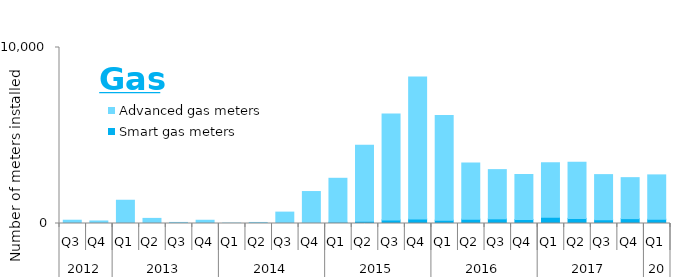
| Category | Smart gas meters | Advanced gas meters             |
|---|---|---|
| 0 | 0 | 186 |
| 1 | 0 | 144 |
| 2 | 0 | 1321 |
| 3 | 0 | 290 |
| 4 | 0 | 60 |
| 5 | 0 | 184 |
| 6 | 0 | 24 |
| 7 | 0 | 59 |
| 8 | 0 | 647 |
| 9 | 30 | 1786 |
| 10 | 72 | 2497 |
| 11 | 129 | 4323 |
| 12 | 202 | 6018 |
| 13 | 257 | 8071 |
| 14 | 187 | 5948 |
| 15 | 247 | 3185 |
| 16 | 264 | 2797 |
| 17 | 228 | 2557 |
| 18 | 353 | 3105 |
| 19 | 290 | 3185 |
| 20 | 213 | 2565 |
| 21 | 276 | 2329 |
| 22 | 241 | 2521 |